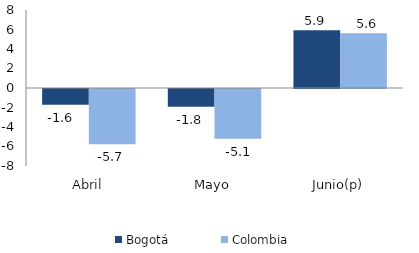
| Category | Bogotá | Colombia |
|---|---|---|
| Abril | -1.614 | -5.667 |
| Mayo | -1.825 | -5.105 |
| Junio(p) | 5.932 | 5.606 |